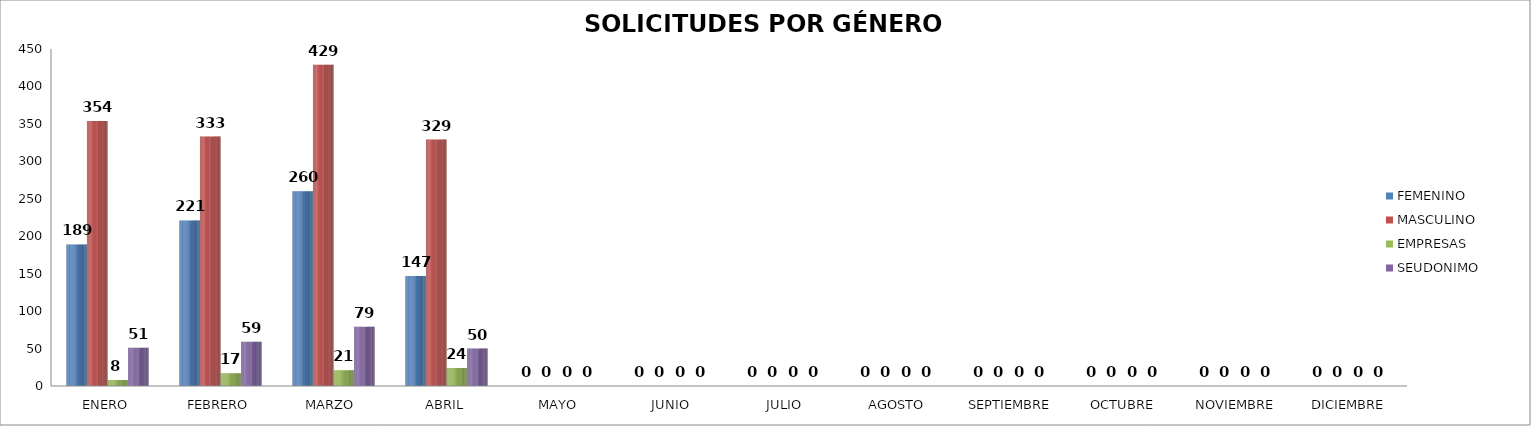
| Category | FEMENINO | MASCULINO | EMPRESAS | SEUDONIMO |
|---|---|---|---|---|
| ENERO | 189 | 354 | 8 | 51 |
| FEBRERO | 221 | 333 | 17 | 59 |
| MARZO  | 260 | 429 | 21 | 79 |
| ABRIL | 147 | 329 | 24 | 50 |
| MAYO | 0 | 0 | 0 | 0 |
| JUNIO | 0 | 0 | 0 | 0 |
| JULIO | 0 | 0 | 0 | 0 |
| AGOSTO | 0 | 0 | 0 | 0 |
| SEPTIEMBRE | 0 | 0 | 0 | 0 |
| OCTUBRE | 0 | 0 | 0 | 0 |
| NOVIEMBRE | 0 | 0 | 0 | 0 |
| DICIEMBRE | 0 | 0 | 0 | 0 |